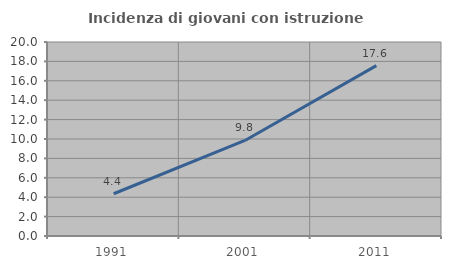
| Category | Incidenza di giovani con istruzione universitaria |
|---|---|
| 1991.0 | 4.355 |
| 2001.0 | 9.848 |
| 2011.0 | 17.566 |